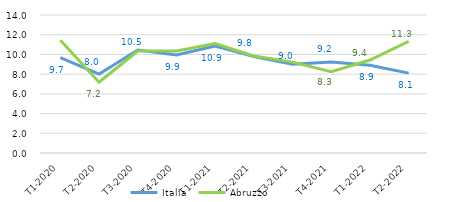
| Category | Italia | Abruzzo |
|---|---|---|
|   T1-2020 | 9.667 | 11.44 |
|   T2-2020 | 8.005 | 7.179 |
|   T3-2020 | 10.452 | 10.338 |
|   T4-2020 | 9.94 | 10.345 |
|   T1-2021 | 10.854 | 11.098 |
|   T2-2021 | 9.774 | 9.837 |
|   T3-2021 | 9.006 | 9.219 |
|   T4-2021 | 9.222 | 8.254 |
|   T1-2022 | 8.898 | 9.43 |
|   T2-2022 | 8.105 | 11.322 |